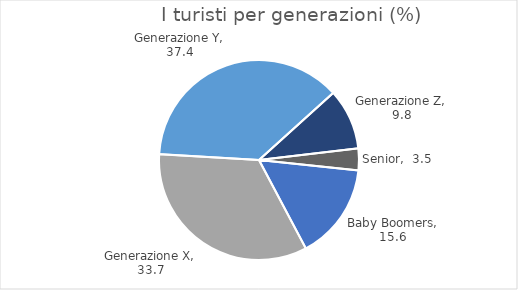
| Category | Series 0 |
|---|---|
| Baby Boomers | 15.579 |
| Generazione X | 33.684 |
| Generazione Y | 37.366 |
| Generazione Z | 9.842 |
| Senior | 3.53 |